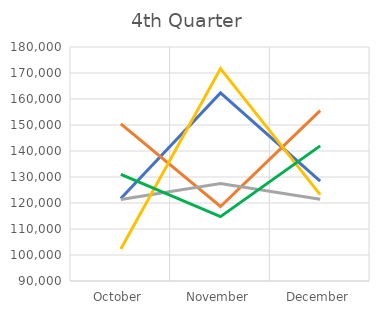
| Category | Atlantic | Midwest | Northeast | Pacific | Southwest |
|---|---|---|---|---|---|
| October | 121743 | 150420 | 121367 | 102283 | 131023 |
| November | 162364 | 118644 | 127504 | 171697 | 114747 |
| December | 128398 | 155534 | 121481 | 123228 | 141966 |